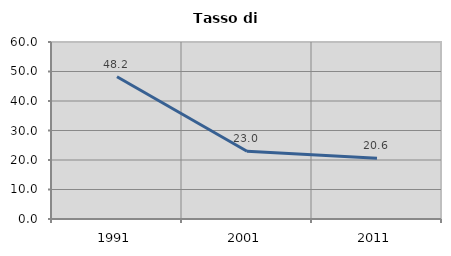
| Category | Tasso di disoccupazione   |
|---|---|
| 1991.0 | 48.205 |
| 2001.0 | 22.962 |
| 2011.0 | 20.62 |